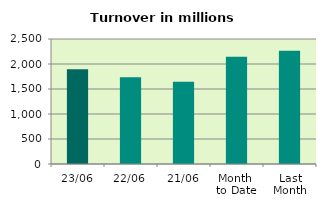
| Category | Series 0 |
|---|---|
| 23/06 | 1893.083 |
| 22/06 | 1737.128 |
| 21/06 | 1644.228 |
| Month 
to Date | 2146.269 |
| Last
Month | 2265.206 |